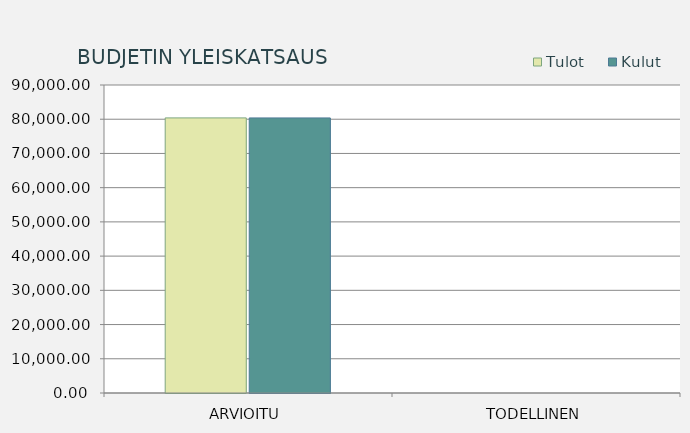
| Category | Tulot | Kulut |
|---|---|---|
| ARVIOITU | 80388.04 | 80375.84 |
| TODELLINEN | 0 | 0 |